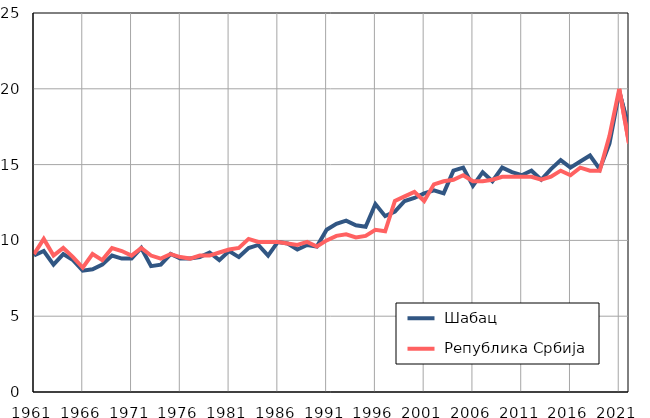
| Category |  Шабац |  Република Србија |
|---|---|---|
| 1961.0 | 9 | 9.1 |
| 1962.0 | 9.3 | 10.1 |
| 1963.0 | 8.4 | 9 |
| 1964.0 | 9.1 | 9.5 |
| 1965.0 | 8.7 | 8.9 |
| 1966.0 | 8 | 8.2 |
| 1967.0 | 8.1 | 9.1 |
| 1968.0 | 8.4 | 8.7 |
| 1969.0 | 9 | 9.5 |
| 1970.0 | 8.8 | 9.3 |
| 1971.0 | 8.8 | 9 |
| 1972.0 | 9.5 | 9.5 |
| 1973.0 | 8.3 | 9 |
| 1974.0 | 8.4 | 8.8 |
| 1975.0 | 9.1 | 9.1 |
| 1976.0 | 8.8 | 8.9 |
| 1977.0 | 8.8 | 8.8 |
| 1978.0 | 8.9 | 9 |
| 1979.0 | 9.2 | 9 |
| 1980.0 | 8.7 | 9.2 |
| 1981.0 | 9.3 | 9.4 |
| 1982.0 | 8.9 | 9.5 |
| 1983.0 | 9.5 | 10.1 |
| 1984.0 | 9.7 | 9.9 |
| 1985.0 | 9 | 9.9 |
| 1986.0 | 9.9 | 9.9 |
| 1987.0 | 9.8 | 9.8 |
| 1988.0 | 9.4 | 9.7 |
| 1989.0 | 9.7 | 9.9 |
| 1990.0 | 9.6 | 9.6 |
| 1991.0 | 10.7 | 10 |
| 1992.0 | 11.1 | 10.3 |
| 1993.0 | 11.3 | 10.4 |
| 1994.0 | 11 | 10.2 |
| 1995.0 | 10.9 | 10.3 |
| 1996.0 | 12.4 | 10.7 |
| 1997.0 | 11.6 | 10.6 |
| 1998.0 | 11.9 | 12.6 |
| 1999.0 | 12.6 | 12.9 |
| 2000.0 | 12.8 | 13.2 |
| 2001.0 | 13.1 | 12.6 |
| 2002.0 | 13.3 | 13.7 |
| 2003.0 | 13.1 | 13.9 |
| 2004.0 | 14.6 | 14 |
| 2005.0 | 14.8 | 14.3 |
| 2006.0 | 13.6 | 13.9 |
| 2007.0 | 14.5 | 13.9 |
| 2008.0 | 13.9 | 14 |
| 2009.0 | 14.8 | 14.2 |
| 2010.0 | 14.5 | 14.2 |
| 2011.0 | 14.3 | 14.2 |
| 2012.0 | 14.6 | 14.2 |
| 2013.0 | 14 | 14 |
| 2014.0 | 14.7 | 14.2 |
| 2015.0 | 15.3 | 14.6 |
| 2016.0 | 14.8 | 14.3 |
| 2017.0 | 15.2 | 14.8 |
| 2018.0 | 15.6 | 14.6 |
| 2019.0 | 14.7 | 14.6 |
| 2020.0 | 16.4 | 16.9 |
| 2021.0 | 19.8 | 20 |
| 2022.0 | 17.4 | 16.4 |